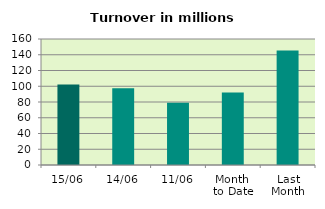
| Category | Series 0 |
|---|---|
| 15/06 | 102.113 |
| 14/06 | 97.441 |
| 11/06 | 79.18 |
| Month 
to Date | 92.191 |
| Last
Month | 145.388 |